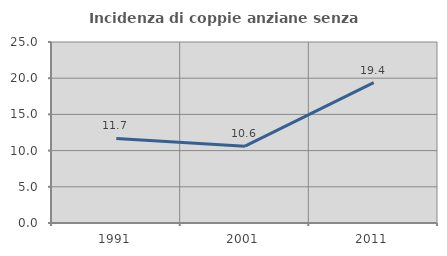
| Category | Incidenza di coppie anziane senza figli  |
|---|---|
| 1991.0 | 11.679 |
| 2001.0 | 10.606 |
| 2011.0 | 19.38 |